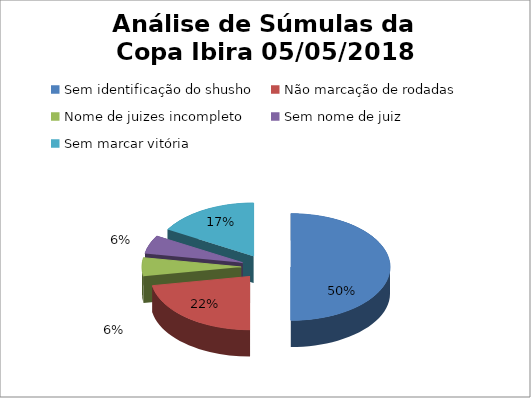
| Category | Series 1 | Series 0 |
|---|---|---|
| Sem identificação do shusho | 0.5 | 9 |
| Não marcação de rodadas | 0.222 | 4 |
| Nome de juizes incompleto | 0.056 | 1 |
| Sem nome de juiz  | 0.056 | 1 |
| Sem marcar vitória | 0.167 | 3 |